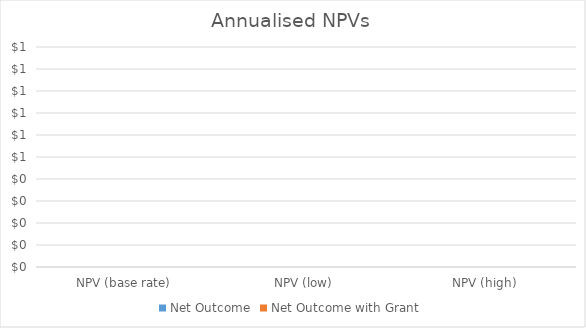
| Category | Net Outcome | Net Outcome with Grant  |
|---|---|---|
| NPV (base rate) | 0 | 0 |
| NPV (low) | 0 | 0 |
| NPV (high) | 0 | 0 |